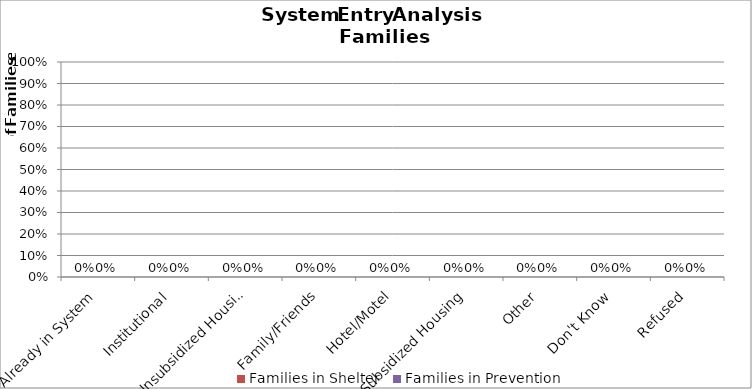
| Category | Families in Shelter | Families in Prevention |
|---|---|---|
| Already in System | 0 | 0 |
| Institutional | 0 | 0 |
| Unsubsidized Housing | 0 | 0 |
| Family/Friends | 0 | 0 |
| Hotel/Motel | 0 | 0 |
| Subsidized Housing | 0 | 0 |
| Other | 0 | 0 |
| Don't Know | 0 | 0 |
| Refused | 0 | 0 |